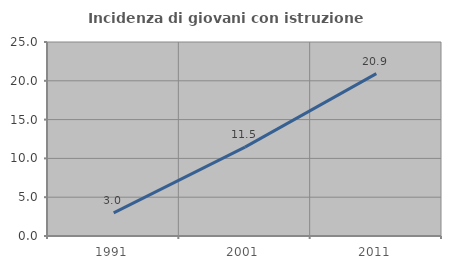
| Category | Incidenza di giovani con istruzione universitaria |
|---|---|
| 1991.0 | 2.97 |
| 2001.0 | 11.45 |
| 2011.0 | 20.93 |